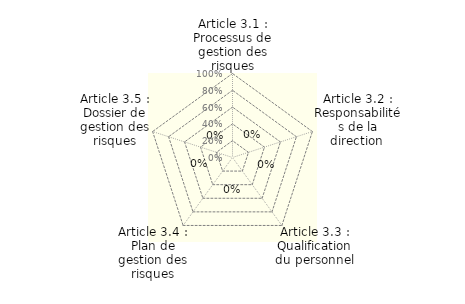
| Category | Series 0 |
|---|---|
| Article 3.1 : Processus de gestion des risques | 0 |
| Article 3.2 : Responsabilités de la direction  | 0 |
| Article 3.3 : Qualification du personnel | 0 |
| Article 3.4 : Plan de gestion des risques | 0 |
| Article 3.5 : Dossier de gestion des risques | 0 |